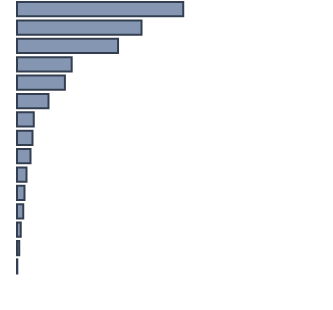
| Category | Series 0 |
|---|---|
| 0 | 53.8 |
| 1 | 40.3 |
| 2 | 32.7 |
| 3 | 17.7 |
| 4 | 15.5 |
| 5 | 10.2 |
| 6 | 5.4 |
| 7 | 5 |
| 8 | 4.4 |
| 9 | 3.1 |
| 10 | 2.4 |
| 11 | 2 |
| 12 | 1.2 |
| 13 | 0.7 |
| 14 | 0.1 |
| 15 | 0 |